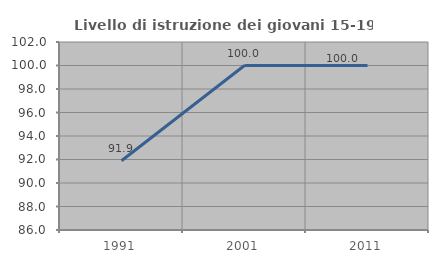
| Category | Livello di istruzione dei giovani 15-19 anni |
|---|---|
| 1991.0 | 91.892 |
| 2001.0 | 100 |
| 2011.0 | 100 |